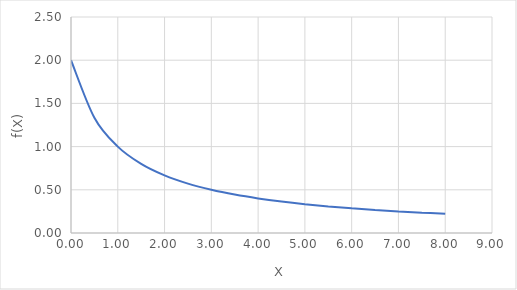
| Category | Series 0 |
|---|---|
| 0.0 | 2 |
| 0.5 | 1.333 |
| 1.0 | 1 |
| 1.5 | 0.8 |
| 2.0 | 0.667 |
| 2.5 | 0.571 |
| 3.0 | 0.5 |
| 3.5 | 0.444 |
| 4.0 | 0.4 |
| 4.5 | 0.364 |
| 5.0 | 0.333 |
| 5.5 | 0.308 |
| 6.0 | 0.286 |
| 6.5 | 0.267 |
| 7.0 | 0.25 |
| 7.5 | 0.235 |
| 8.0 | 0.222 |